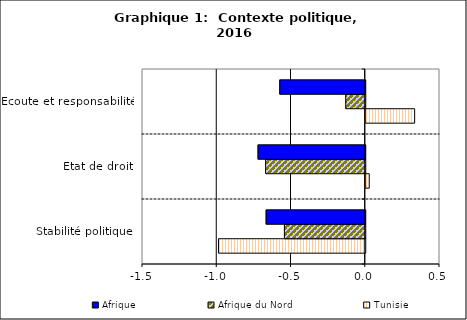
| Category | Tunisie | Afrique du Nord | Afrique |
|---|---|---|---|
| Stabilité politique | -0.988 | -0.544 | -0.667 |
| Etat de droit | 0.023 | -0.671 | -0.722 |
| Ecoute et responsabilité | 0.329 | -0.131 | -0.576 |